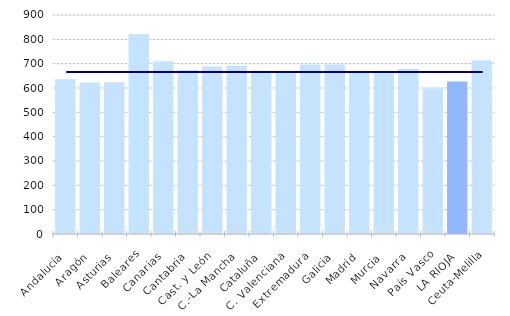
| Category | Series 1 |
|---|---|
| Andalucía | 635.859 |
| Aragón | 622.58 |
| Asturias | 623.355 |
| Baleares | 821.445 |
| Canarias | 710.01 |
| Cantabria | 674.03 |
| Cast. y León | 688.435 |
| C.-La Mancha | 691.018 |
| Cataluña | 670.621 |
| C. Valenciana | 661.723 |
| Extremadura | 696.035 |
| Galicia | 696.754 |
| Madrid | 663.262 |
| Murcia | 668.9 |
| Navarra | 679.048 |
| País Vasco | 598.82 |
| LA RIOJA | 626.318 |
| Ceuta-Melilla | 714.124 |